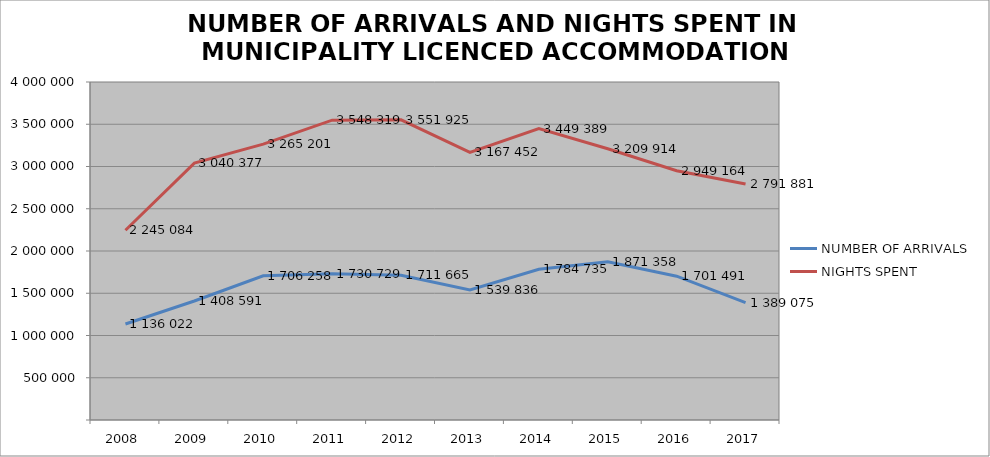
| Category | NUMBER OF ARRIVALS | NIGHTS SPENT |
|---|---|---|
| 2008 | 1136022 | 2245084 |
| 2009 | 1408591 | 3040377 |
| 2010 | 1706258 | 3265201 |
| 2011 | 1730729 | 3548319 |
| 2012 | 1711665 | 3551925 |
| 2013 | 1539836 | 3167452 |
| 2014 | 1784735 | 3449389 |
| 2015 | 1871358 | 3209914 |
| 2016 | 1701491 | 2949164 |
| 2017 | 1389075 | 2791881 |